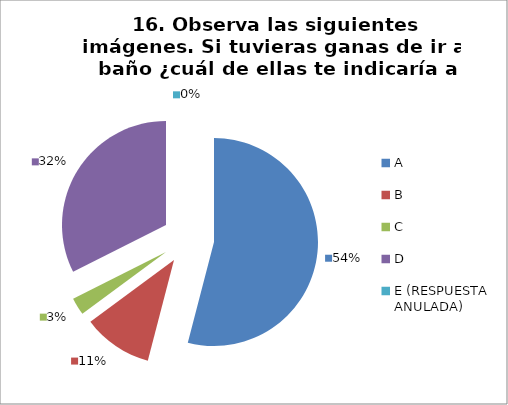
| Category | CANTIDAD DE RESPUESTAS PREGUNTA (16) | PORCENTAJE |
|---|---|---|
| A | 20 | 0.541 |
| B | 4 | 0.108 |
| C | 1 | 0.027 |
| D | 12 | 0.324 |
| E (RESPUESTA ANULADA) | 0 | 0 |